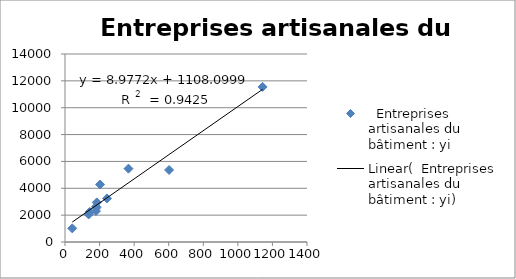
| Category |   Entreprises artisanales du bâtiment : yi |
|---|---|
| 137.0 | 2048 |
| 42.0 | 1016 |
| 179.0 | 2304 |
| 203.0 | 4283 |
| 1143.0 | 11550 |
| 243.0 | 3245 |
| 184.0 | 2947 |
| 602.0 | 5364 |
| 180.0 | 2637 |
| 367.0 | 5464 |
| 143.0 | 2241 |
| 182.0 | 2561 |